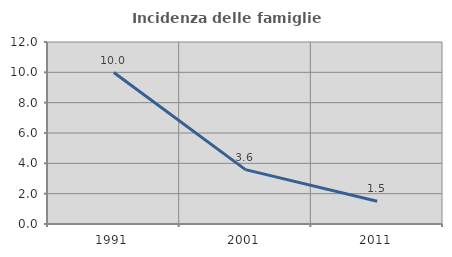
| Category | Incidenza delle famiglie numerose |
|---|---|
| 1991.0 | 9.988 |
| 2001.0 | 3.586 |
| 2011.0 | 1.501 |